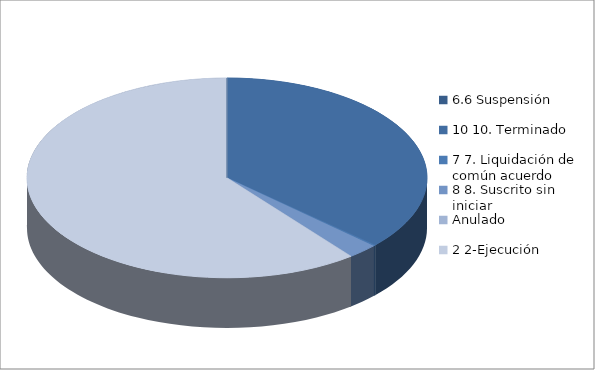
| Category | Series 0 |
|---|---|
| 6.6 Suspensión | 0 |
| 10 10. Terminado | 195 |
| 7 7. Liquidación de común acuerdo | 1 |
| 8 8. Suscrito sin iniciar | 13 |
| Anulado | 0 |
| 2 2-Ejecución | 322 |